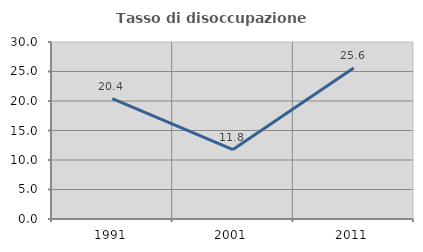
| Category | Tasso di disoccupazione giovanile  |
|---|---|
| 1991.0 | 20.423 |
| 2001.0 | 11.765 |
| 2011.0 | 25.61 |